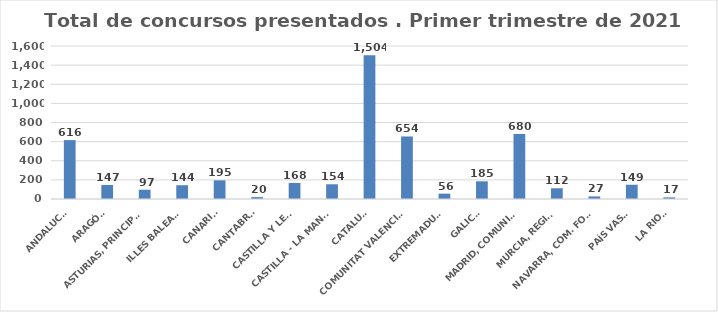
| Category | 616 |
|---|---|
| ANDALUCÍA | 616 |
| ARAGÓN | 147 |
| ASTURIAS, PRINCIPADO | 97 |
| ILLES BALEARS | 144 |
| CANARIAS | 195 |
| CANTABRIA | 20 |
| CASTILLA Y LEÓN | 168 |
| CASTILLA - LA MANCHA | 154 |
| CATALUÑA | 1504 |
| COMUNITAT VALENCIANA | 654 |
| EXTREMADURA | 56 |
| GALICIA | 185 |
| MADRID, COMUNIDAD | 680 |
| MURCIA, REGIÓN | 112 |
| NAVARRA, COM. FORAL | 27 |
| PAÍS VASCO | 149 |
| LA RIOJA | 17 |